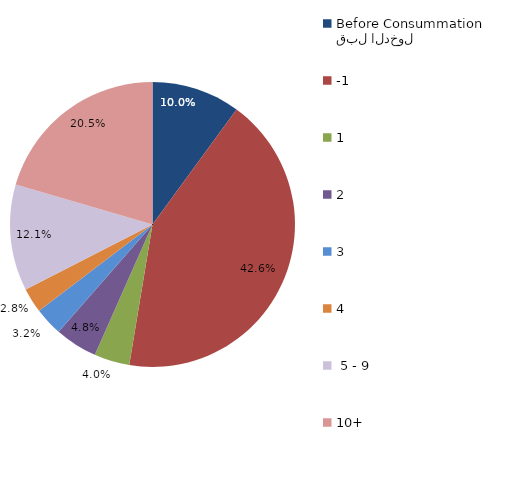
| Category | Series 0 |
|---|---|
| قبل الدخول
Before Consummation | 10.04 |
| -1 | 42.57 |
| 1 | 4.016 |
| 2 | 4.819 |
| 3 | 3.213 |
| 4 | 2.811 |
|  5 - 9 | 12.048 |
| 10+ | 20.482 |